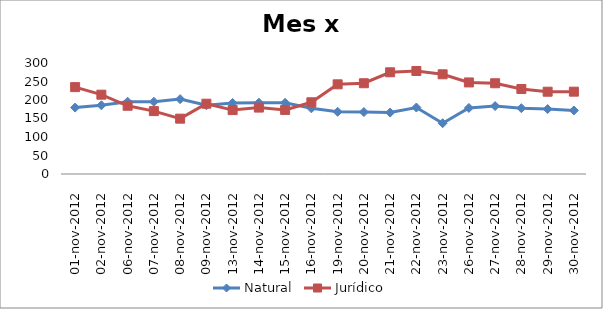
| Category | Natural | Jurídico |
|---|---|---|
| 01-nov-2012 | 179.525 | 234.816 |
| 02-nov-2012 | 185.692 | 214.393 |
| 06-nov-2012 | 195.317 | 184.418 |
| 07-nov-2012 | 195.189 | 169.938 |
| 08-nov-2012 | 202.35 | 149.572 |
| 09-nov-2012 | 185.734 | 189.993 |
| 13-nov-2012 | 191.892 | 172.737 |
| 14-nov-2012 | 192.715 | 179.51 |
| 15-nov-2012 | 192.368 | 173.216 |
| 16-nov-2012 | 177.604 | 193.873 |
| 19-nov-2012 | 168.144 | 242.361 |
| 20-nov-2012 | 167.378 | 245.341 |
| 21-nov-2012 | 166.045 | 274.876 |
| 22-nov-2012 | 179.675 | 278.405 |
| 23-nov-2012 | 137.276 | 269.47 |
| 26-nov-2012 | 178.563 | 247.445 |
| 27-nov-2012 | 183.541 | 245.291 |
| 28-nov-2012 | 177.888 | 229.812 |
| 29-nov-2012 | 175.445 | 222.419 |
| 30-nov-2012 | 171.677 | 222.526 |